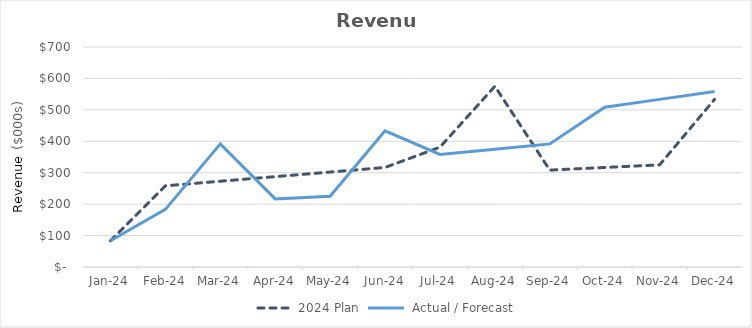
| Category | 2024 Plan |  Actual / Forecast |
|---|---|---|
| 2024-01-31 | 83.333 | 83.333 |
| 2024-02-29 | 258.333 | 183.333 |
| 2024-03-31 | 272.917 | 391.667 |
| 2024-04-30 | 287.5 | 216.667 |
| 2024-05-31 | 302.083 | 225 |
| 2024-06-30 | 316.667 | 433.333 |
| 2024-07-31 | 381.25 | 358.333 |
| 2024-08-31 | 575 | 375 |
| 2024-09-30 | 308.333 | 391.667 |
| 2024-10-31 | 316.667 | 508.333 |
| 2024-11-30 | 325 | 533.333 |
| 2024-12-31 | 533.333 | 558.333 |